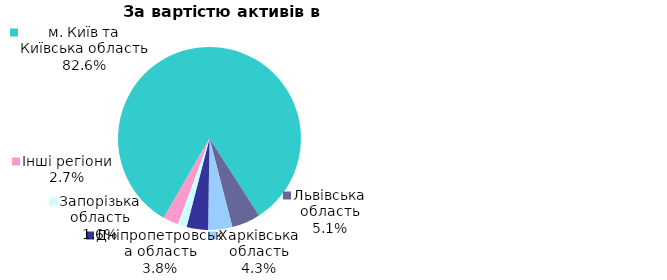
| Category | Series 0 |
|---|---|
| м. Київ та Київська область | 0.826 |
| Львівська область | 0.051 |
| Харківська область | 0.043 |
| Дніпропетровська область | 0.038 |
| Запорізька область | 0.016 |
| Інші регіони | 0.027 |